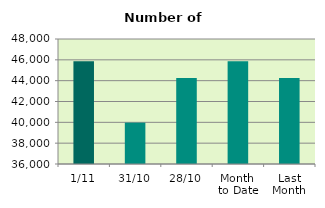
| Category | Series 0 |
|---|---|
| 1/11 | 45876 |
| 31/10 | 39972 |
| 28/10 | 44260 |
| Month 
to Date | 45876 |
| Last
Month | 44266.476 |